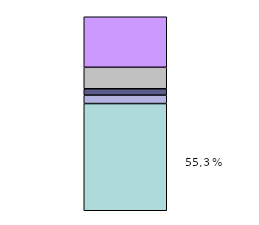
| Category | Series 0 | Series 1 | Series 2 | Series 3 | Series 4 |
|---|---|---|---|---|---|
| 0 | 168923.47 | 13231.274 | 10076.245 | 33856.207 | 79616.953 |